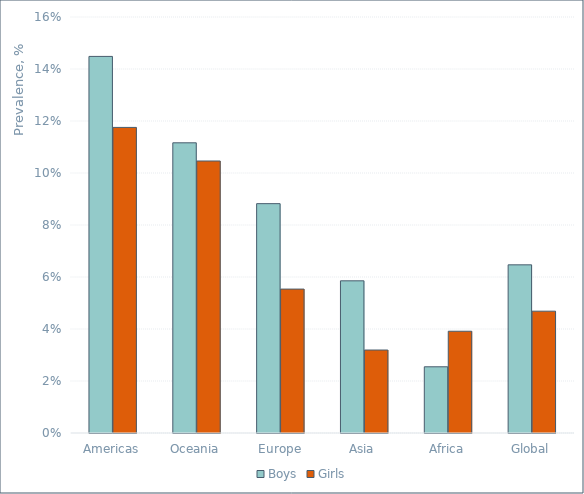
| Category | Boys | Girls |
|---|---|---|
| Americas | 0.145 | 0.118 |
| Oceania | 0.112 | 0.105 |
| Europe | 0.088 | 0.055 |
| Asia | 0.059 | 0.032 |
| Africa | 0.025 | 0.039 |
| Global | 0.065 | 0.047 |